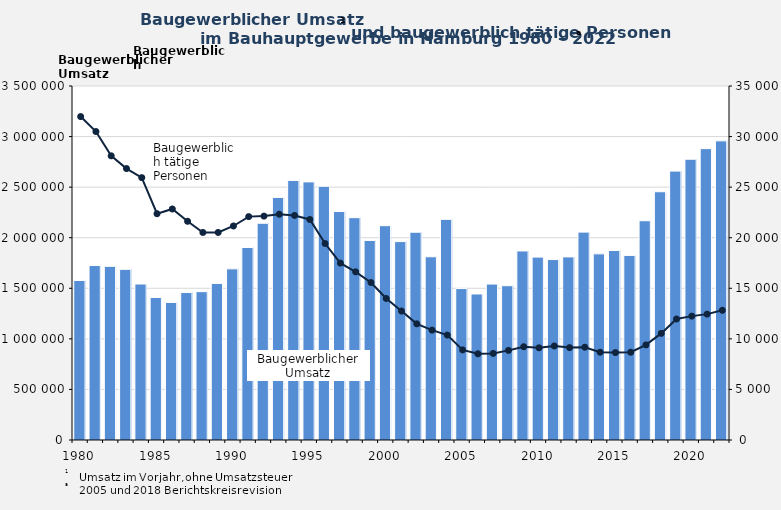
| Category | Baugewerblicher Umsatz in 1 000 Euro |
|---|---|
| 1980.0 | 1577270 |
| 1981.0 | 1725081 |
| 1982.0 | 1717054 |
| 1983.0 | 1687028 |
| 1984.0 | 1542105 |
| 1985.0 | 1409475 |
| 1986.0 | 1360220 |
| 1987.0 | 1457919 |
| 1988.0 | 1466564 |
| 1989.0 | 1548322 |
| 1990.0 | 1692218 |
| 1991.0 | 1902955 |
| 1992.0 | 2142829 |
| 1993.0 | 2398226 |
| 1994.0 | 2566172 |
| 1995.0 | 2551976 |
| 1996.0 | 2508374 |
| 1997.0 | 2258721 |
| 1998.0 | 2198312 |
| 1999.0 | 1973038 |
| 2000.0 | 2118942 |
| 2001.0 | 1961657 |
| 2002.0 | 2054471 |
| 2003.0 | 1811409 |
| 2004.0 | 2181467 |
| 2005.0 | 1497168 |
| 2006.0 | 1443884 |
| 2007.0 | 1541748 |
| 2008.0 | 1525609 |
| 2009.0 | 1868990 |
| 2010.0 | 1808186 |
| 2011.0 | 1783985 |
| 2012.0 | 1810324 |
| 2013.0 | 2055370 |
| 2014.0 | 1840447 |
| 2015.0 | 1873640 |
| 2016.0 | 1825008 |
| 2017.0 | 2168006 |
| 2018.0 | 2454584 |
| 2019.0 | 2658557 |
| 2020.0 | 2775882 |
| 2021.0 | 2880717 |
| 2022.0 | 2957547 |